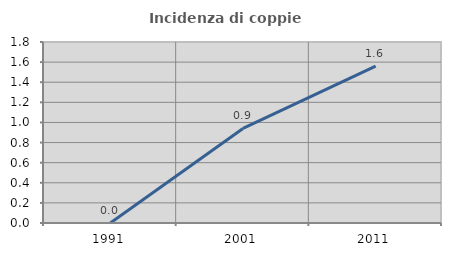
| Category | Incidenza di coppie miste |
|---|---|
| 1991.0 | 0 |
| 2001.0 | 0.94 |
| 2011.0 | 1.56 |